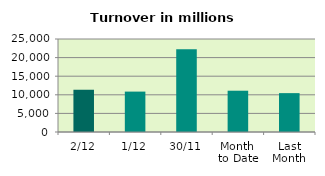
| Category | Series 0 |
|---|---|
| 2/12 | 11336.082 |
| 1/12 | 10860.98 |
| 30/11 | 22252.405 |
| Month 
to Date | 11098.531 |
| Last
Month | 10449.431 |